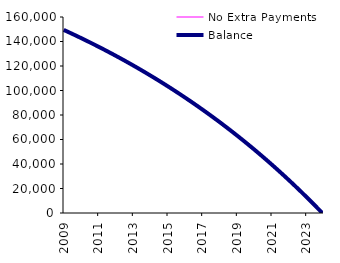
| Category | No Extra Payments | Balance |
|---|---|---|
| 2009-01-01 | 149461.87 | 149461.87 |
| 2009-02-01 | 148921.27 | 148921.27 |
| 2009-03-01 | 148378.2 | 148378.2 |
| 2009-04-01 | 147832.64 | 147832.64 |
| 2009-05-01 | 147284.58 | 147284.58 |
| 2009-06-01 | 146734 | 146734 |
| 2009-07-01 | 146180.9 | 146180.9 |
| 2009-08-01 | 145625.27 | 145625.27 |
| 2009-09-01 | 145067.09 | 145067.09 |
| 2009-10-01 | 144506.35 | 144506.35 |
| 2009-11-01 | 143943.04 | 143943.04 |
| 2009-12-01 | 143377.15 | 143377.15 |
| 2010-01-01 | 142808.67 | 142808.67 |
| 2010-02-01 | 142237.58 | 142237.58 |
| 2010-03-01 | 141663.87 | 141663.87 |
| 2010-04-01 | 141087.53 | 141087.53 |
| 2010-05-01 | 140508.55 | 140508.55 |
| 2010-06-01 | 139926.92 | 139926.92 |
| 2010-07-01 | 139342.62 | 139342.62 |
| 2010-08-01 | 138755.64 | 138755.64 |
| 2010-09-01 | 138165.97 | 138165.97 |
| 2010-10-01 | 137573.6 | 137573.6 |
| 2010-11-01 | 136978.52 | 136978.52 |
| 2010-12-01 | 136380.71 | 136380.71 |
| 2011-01-01 | 135780.16 | 135780.16 |
| 2011-02-01 | 135176.86 | 135176.86 |
| 2011-03-01 | 134570.79 | 134570.79 |
| 2011-04-01 | 133961.94 | 133961.94 |
| 2011-05-01 | 133350.3 | 133350.3 |
| 2011-06-01 | 132735.86 | 132735.86 |
| 2011-07-01 | 132118.6 | 132118.6 |
| 2011-08-01 | 131498.51 | 131498.51 |
| 2011-09-01 | 130875.58 | 130875.58 |
| 2011-10-01 | 130249.8 | 130249.8 |
| 2011-11-01 | 129621.15 | 129621.15 |
| 2011-12-01 | 128989.62 | 128989.62 |
| 2012-01-01 | 128355.19 | 128355.19 |
| 2012-02-01 | 127717.85 | 127717.85 |
| 2012-03-01 | 127077.59 | 127077.59 |
| 2012-04-01 | 126434.4 | 126434.4 |
| 2012-05-01 | 125788.26 | 125788.26 |
| 2012-06-01 | 125139.16 | 125139.16 |
| 2012-07-01 | 124487.08 | 124487.08 |
| 2012-08-01 | 123832.02 | 123832.02 |
| 2012-09-01 | 123173.95 | 123173.95 |
| 2012-10-01 | 122512.87 | 122512.87 |
| 2012-11-01 | 121848.76 | 121848.76 |
| 2012-12-01 | 121181.6 | 121181.6 |
| 2013-01-01 | 120511.39 | 120511.39 |
| 2013-02-01 | 119838.1 | 119838.1 |
| 2013-03-01 | 119161.73 | 119161.73 |
| 2013-04-01 | 118482.26 | 118482.26 |
| 2013-05-01 | 117799.67 | 117799.67 |
| 2013-06-01 | 117113.96 | 117113.96 |
| 2013-07-01 | 116425.1 | 116425.1 |
| 2013-08-01 | 115733.09 | 115733.09 |
| 2013-09-01 | 115037.9 | 115037.9 |
| 2013-10-01 | 114339.53 | 114339.53 |
| 2013-11-01 | 113637.96 | 113637.96 |
| 2013-12-01 | 112933.17 | 112933.17 |
| 2014-01-01 | 112225.15 | 112225.15 |
| 2014-02-01 | 111513.89 | 111513.89 |
| 2014-03-01 | 110799.37 | 110799.37 |
| 2014-04-01 | 110081.57 | 110081.57 |
| 2014-05-01 | 109360.48 | 109360.48 |
| 2014-06-01 | 108636.09 | 108636.09 |
| 2014-07-01 | 107908.38 | 107908.38 |
| 2014-08-01 | 107177.33 | 107177.33 |
| 2014-09-01 | 106442.93 | 106442.93 |
| 2014-10-01 | 105705.16 | 105705.16 |
| 2014-11-01 | 104964.01 | 104964.01 |
| 2014-12-01 | 104219.47 | 104219.47 |
| 2015-01-01 | 103471.51 | 103471.51 |
| 2015-02-01 | 102720.12 | 102720.12 |
| 2015-03-01 | 101965.29 | 101965.29 |
| 2015-04-01 | 101207 | 101207 |
| 2015-05-01 | 100445.24 | 100445.24 |
| 2015-06-01 | 99679.98 | 99679.98 |
| 2015-07-01 | 98911.22 | 98911.22 |
| 2015-08-01 | 98138.93 | 98138.93 |
| 2015-09-01 | 97363.1 | 97363.1 |
| 2015-10-01 | 96583.72 | 96583.72 |
| 2015-11-01 | 95800.77 | 95800.77 |
| 2015-12-01 | 95014.23 | 95014.23 |
| 2016-01-01 | 94224.08 | 94224.08 |
| 2016-02-01 | 93430.31 | 93430.31 |
| 2016-03-01 | 92632.9 | 92632.9 |
| 2016-04-01 | 91831.84 | 91831.84 |
| 2016-05-01 | 91027.11 | 91027.11 |
| 2016-06-01 | 90218.69 | 90218.69 |
| 2016-07-01 | 89406.56 | 89406.56 |
| 2016-08-01 | 88590.71 | 88590.71 |
| 2016-09-01 | 87771.12 | 87771.12 |
| 2016-10-01 | 86947.77 | 86947.77 |
| 2016-11-01 | 86120.65 | 86120.65 |
| 2016-12-01 | 85289.74 | 85289.74 |
| 2017-01-01 | 84455.02 | 84455.02 |
| 2017-02-01 | 83616.48 | 83616.48 |
| 2017-03-01 | 82774.09 | 82774.09 |
| 2017-04-01 | 81927.84 | 81927.84 |
| 2017-05-01 | 81077.71 | 81077.71 |
| 2017-06-01 | 80223.69 | 80223.69 |
| 2017-07-01 | 79365.75 | 79365.75 |
| 2017-08-01 | 78503.88 | 78503.88 |
| 2017-09-01 | 77638.06 | 77638.06 |
| 2017-10-01 | 76768.27 | 76768.27 |
| 2017-11-01 | 75894.49 | 75894.49 |
| 2017-12-01 | 75016.71 | 75016.71 |
| 2018-01-01 | 74134.91 | 74134.91 |
| 2018-02-01 | 73249.07 | 73249.07 |
| 2018-03-01 | 72359.16 | 72359.16 |
| 2018-04-01 | 71465.18 | 71465.18 |
| 2018-05-01 | 70567.1 | 70567.1 |
| 2018-06-01 | 69664.9 | 69664.9 |
| 2018-07-01 | 68758.57 | 68758.57 |
| 2018-08-01 | 67848.08 | 67848.08 |
| 2018-09-01 | 66933.42 | 66933.42 |
| 2018-10-01 | 66014.57 | 66014.57 |
| 2018-11-01 | 65091.51 | 65091.51 |
| 2018-12-01 | 64164.22 | 64164.22 |
| 2019-01-01 | 63232.68 | 63232.68 |
| 2019-02-01 | 62296.87 | 62296.87 |
| 2019-03-01 | 61356.77 | 61356.77 |
| 2019-04-01 | 60412.36 | 60412.36 |
| 2019-05-01 | 59463.62 | 59463.62 |
| 2019-06-01 | 58510.53 | 58510.53 |
| 2019-07-01 | 57553.07 | 57553.07 |
| 2019-08-01 | 56591.22 | 56591.22 |
| 2019-09-01 | 55624.97 | 55624.97 |
| 2019-10-01 | 54654.29 | 54654.29 |
| 2019-11-01 | 53679.16 | 53679.16 |
| 2019-12-01 | 52699.56 | 52699.56 |
| 2020-01-01 | 51715.47 | 51715.47 |
| 2020-02-01 | 50726.87 | 50726.87 |
| 2020-03-01 | 49733.74 | 49733.74 |
| 2020-04-01 | 48736.06 | 48736.06 |
| 2020-05-01 | 47733.8 | 47733.8 |
| 2020-06-01 | 46726.95 | 46726.95 |
| 2020-07-01 | 45715.49 | 45715.49 |
| 2020-08-01 | 44699.39 | 44699.39 |
| 2020-09-01 | 43678.63 | 43678.63 |
| 2020-10-01 | 42653.19 | 42653.19 |
| 2020-11-01 | 41623.05 | 41623.05 |
| 2020-12-01 | 40588.19 | 40588.19 |
| 2021-01-01 | 39548.59 | 39548.59 |
| 2021-02-01 | 38504.22 | 38504.22 |
| 2021-03-01 | 37455.07 | 37455.07 |
| 2021-04-01 | 36401.11 | 36401.11 |
| 2021-05-01 | 35342.32 | 35342.32 |
| 2021-06-01 | 34278.68 | 34278.68 |
| 2021-07-01 | 33210.16 | 33210.16 |
| 2021-08-01 | 32136.74 | 32136.74 |
| 2021-09-01 | 31058.4 | 31058.4 |
| 2021-10-01 | 29975.12 | 29975.12 |
| 2021-11-01 | 28886.88 | 28886.88 |
| 2021-12-01 | 27793.65 | 27793.65 |
| 2022-01-01 | 26695.41 | 26695.41 |
| 2022-02-01 | 25592.13 | 25592.13 |
| 2022-03-01 | 24483.8 | 24483.8 |
| 2022-04-01 | 23370.39 | 23370.39 |
| 2022-05-01 | 22251.87 | 22251.87 |
| 2022-06-01 | 21128.23 | 21128.23 |
| 2022-07-01 | 19999.44 | 19999.44 |
| 2022-08-01 | 18865.47 | 18865.47 |
| 2022-09-01 | 17726.31 | 17726.31 |
| 2022-10-01 | 16581.93 | 16581.93 |
| 2022-11-01 | 15432.3 | 15432.3 |
| 2022-12-01 | 14277.4 | 14277.4 |
| 2023-01-01 | 13117.21 | 13117.21 |
| 2023-02-01 | 11951.7 | 11951.7 |
| 2023-03-01 | 10780.85 | 10780.85 |
| 2023-04-01 | 9604.63 | 9604.63 |
| 2023-05-01 | 8423.02 | 8423.02 |
| 2023-06-01 | 7236 | 7236 |
| 2023-07-01 | 6043.54 | 6043.54 |
| 2023-08-01 | 4845.61 | 4845.61 |
| 2023-09-01 | 3642.19 | 3642.19 |
| 2023-10-01 | 2433.25 | 2433.25 |
| 2023-11-01 | 1218.77 | 1218.77 |
| 2023-12-01 | 0 | 0 |